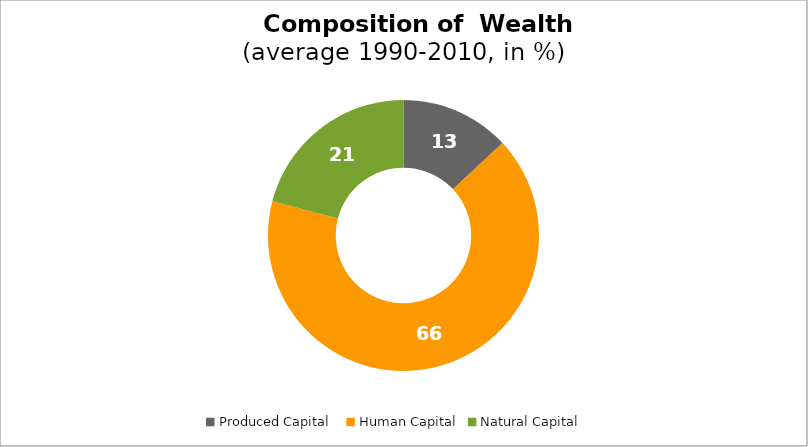
| Category | Series 0 |
|---|---|
| Produced Capital  | 13.045 |
| Human Capital | 66.01 |
| Natural Capital | 20.945 |